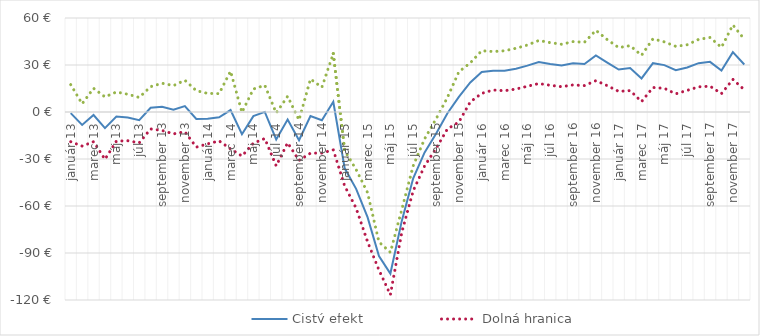
| Category | Čistý efekt | Dolná hranica | Horná hranica |
|---|---|---|---|
| 2013-01-01 | -0.742 | -18.966 | 17.482 |
| 2013-02-01 | -8.26 | -21.741 | 5.22 |
| 2013-03-01 | -1.92 | -18.964 | 15.125 |
| 2013-04-01 | -10.279 | -30.193 | 9.636 |
| 2013-05-01 | -2.926 | -18.611 | 12.759 |
| 2013-06-01 | -3.494 | -18.329 | 11.341 |
| 2013-07-01 | -5.221 | -19.714 | 9.272 |
| 2013-08-01 | 2.677 | -10.823 | 16.178 |
| 2013-09-01 | 3.275 | -11.796 | 18.347 |
| 2013-10-01 | 1.45 | -13.959 | 16.859 |
| 2013-11-01 | 3.799 | -12.64 | 20.239 |
| 2013-12-01 | -4.393 | -22.411 | 13.625 |
| 2014-01-01 | -4.238 | -20.35 | 11.875 |
| 2014-02-01 | -3.367 | -18.449 | 11.715 |
| 2014-03-01 | 1.251 | -23.556 | 26.057 |
| 2014-04-01 | -14.165 | -28.109 | -0.22 |
| 2014-05-01 | -2.637 | -19.922 | 14.649 |
| 2014-06-01 | 0.064 | -16.937 | 17.064 |
| 2014-07-01 | -17.515 | -34.412 | -0.619 |
| 2014-08-01 | -4.823 | -19.669 | 10.023 |
| 2014-09-01 | -18.01 | -30.907 | -5.114 |
| 2014-10-01 | -2.613 | -26.271 | 21.044 |
| 2014-11-01 | -5.215 | -26.214 | 15.785 |
| 2014-12-01 | 6.562 | -24.185 | 37.31 |
| 2015-01-01 | -35.938 | -47.239 | -24.636 |
| 2015-02-01 | -49.032 | -61.355 | -36.709 |
| 2015-03-01 | -67.117 | -82.81 | -51.424 |
| 2015-04-01 | -91.934 | -100.884 | -82.983 |
| 2015-05-01 | -103.131 | -116.672 | -89.59 |
| 2015-06-01 | -69.499 | -76.768 | -62.231 |
| 2015-07-01 | -42.316 | -50.279 | -34.353 |
| 2015-08-01 | -25.771 | -34.422 | -17.121 |
| 2015-09-01 | -13.853 | -23.285 | -4.422 |
| 2015-10-01 | -0.762 | -10.829 | 9.305 |
| 2015-11-01 | 9.649 | -6.4 | 25.699 |
| 2015-12-01 | 18.881 | 6.429 | 31.333 |
| 2016-01-01 | 25.49 | 11.878 | 39.102 |
| 2016-02-01 | 26.31 | 14.033 | 38.587 |
| 2016-03-01 | 26.329 | 13.584 | 39.074 |
| 2016-04-01 | 27.63 | 14.613 | 40.647 |
| 2016-05-01 | 29.579 | 16.434 | 42.725 |
| 2016-06-01 | 31.906 | 18.147 | 45.665 |
| 2016-07-01 | 30.661 | 17.051 | 44.272 |
| 2016-08-01 | 29.694 | 16.156 | 43.233 |
| 2016-09-01 | 31.095 | 17.269 | 44.92 |
| 2016-10-01 | 30.674 | 16.852 | 44.497 |
| 2016-11-01 | 36.067 | 20.004 | 52.131 |
| 2016-12-01 | 31.48 | 16.786 | 46.174 |
| 2017-01-01 | 27.11 | 13.125 | 41.095 |
| 2017-02-01 | 28.01 | 13.665 | 42.355 |
| 2017-03-01 | 21.404 | 6.627 | 36.181 |
| 2017-04-01 | 31.158 | 15.642 | 46.673 |
| 2017-05-01 | 29.931 | 15.093 | 44.768 |
| 2017-06-01 | 26.737 | 11.598 | 41.877 |
| 2017-07-01 | 28.369 | 13.799 | 42.939 |
| 2017-08-01 | 31.191 | 16.051 | 46.33 |
| 2017-09-01 | 32.014 | 16.472 | 47.557 |
| 2017-10-01 | 26.483 | 11.717 | 41.248 |
| 2017-11-01 | 38.189 | 20.821 | 55.556 |
| 2017-12-01 | 30.324 | 14.187 | 46.46 |